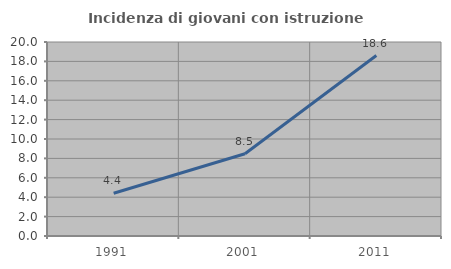
| Category | Incidenza di giovani con istruzione universitaria |
|---|---|
| 1991.0 | 4.412 |
| 2001.0 | 8.475 |
| 2011.0 | 18.605 |